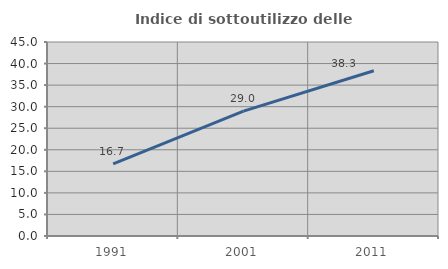
| Category | Indice di sottoutilizzo delle abitazioni  |
|---|---|
| 1991.0 | 16.743 |
| 2001.0 | 28.972 |
| 2011.0 | 38.331 |